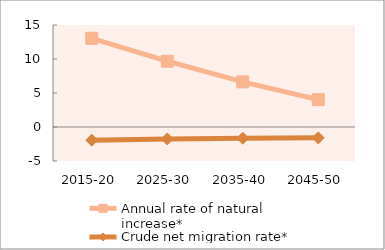
| Category | Annual rate of natural increase* | Crude net migration rate* |
|---|---|---|
| 2015-20 | 13.036 | -1.94 |
| 2025-30 | 9.675 | -1.763 |
| 2035-40 | 6.637 | -1.654 |
| 2045-50 | 4.019 | -1.594 |